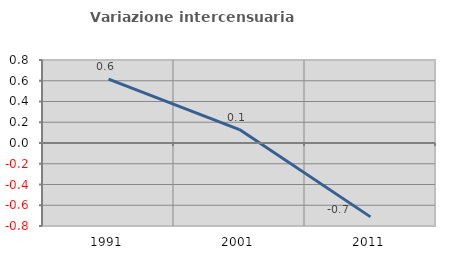
| Category | Variazione intercensuaria annua |
|---|---|
| 1991.0 | 0.616 |
| 2001.0 | 0.129 |
| 2011.0 | -0.712 |